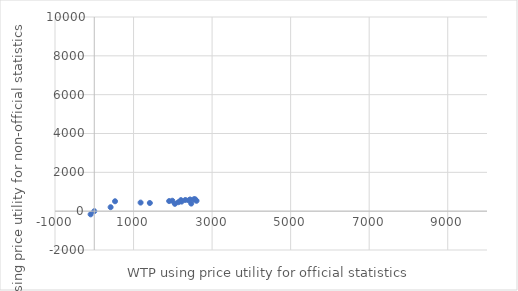
| Category | Series 0 |
|---|---|
| 1414.634601343704 | 420.923 |
| -92.55422370694714 | -163.767 |
| 528.7385734787299 | 509.612 |
| 2439.994003988694 | 601.969 |
| 2206.5634505862045 | 566.988 |
| 2318.1538485182205 | 575.678 |
| 1988.2306986196124 | 537.115 |
| 1907.3084994615797 | 520.049 |
| 2408.5255622590266 | 555.391 |
| 2469.5555231657954 | 391.247 |
| 2603.6964296604037 | 534.787 |
| 2538.517710596001 | 615.336 |
| 2222.621224689371 | 492.329 |
| 2140.4760690153034 | 460.97 |
| 2568.7298487570824 | 610.362 |
| 2052.382938210955 | 377.637 |
| 1179.6042660296416 | 441.407 |
| 0.21793629215501564 | 0.221 |
| 416.3572145784612 | 204.275 |